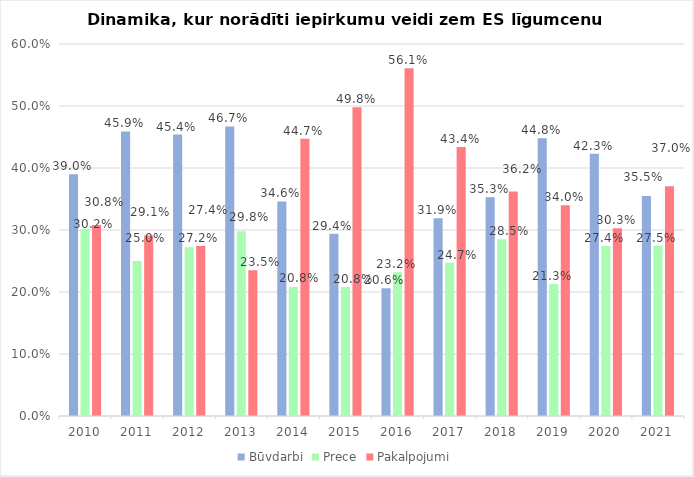
| Category | Būvdarbi | Prece | Pakalpojumi |
|---|---|---|---|
| 2010.0 | 0.39 | 0.302 | 0.308 |
| 2011.0 | 0.459 | 0.25 | 0.291 |
| 2012.0 | 0.454 | 0.272 | 0.274 |
| 2013.0 | 0.467 | 0.298 | 0.235 |
| 2014.0 | 0.346 | 0.208 | 0.447 |
| 2015.0 | 0.294 | 0.208 | 0.498 |
| 2016.0 | 0.206 | 0.232 | 0.561 |
| 2017.0 | 0.319 | 0.247 | 0.434 |
| 2018.0 | 0.353 | 0.285 | 0.362 |
| 2019.0 | 0.448 | 0.213 | 0.34 |
| 2020.0 | 0.423 | 0.274 | 0.303 |
| 2021.0 | 0.355 | 0.275 | 0.37 |